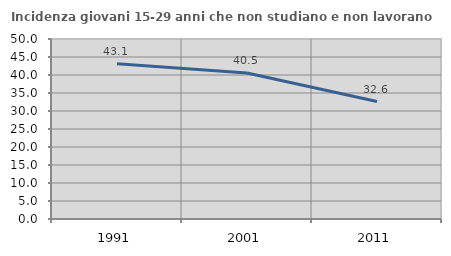
| Category | Incidenza giovani 15-29 anni che non studiano e non lavorano  |
|---|---|
| 1991.0 | 43.103 |
| 2001.0 | 40.549 |
| 2011.0 | 32.62 |